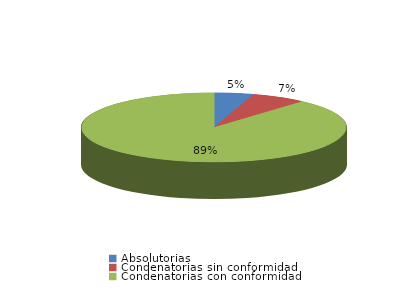
| Category | Series 0 |
|---|---|
| Absolutorias | 10 |
| Condenatorias sin conformidad | 14 |
| Condenatorias con conformidad | 186 |